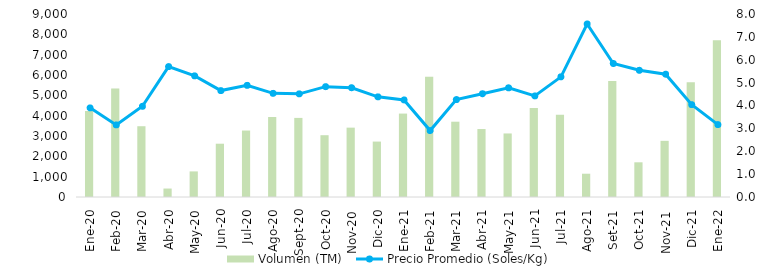
| Category | Volumen (TM)  |
|---|---|
| Ene-20 | 4225.139 |
| Feb-20 | 5332.584 |
| Mar-20 | 3480.674 |
| Abr-20 | 415.99 |
| May-20 | 1258.69 |
| Jun-20 | 2621.059 |
| Jul-20 | 3268.729 |
| Ago-20 | 3933.264 |
| Sept-20 | 3890.325 |
| Oct-20 | 3038.41 |
| Nov-20 | 3410.899 |
| Dic-20 | 2725.555 |
| Ene-21 | 4102.553 |
| Feb-21 | 5912.284 |
| Mar-21 | 3703.291 |
| Abr-21 | 3342.033 |
| May-21 | 3125.02 |
| Jun-21 | 4372.62 |
| Jul-21 | 4044.873 |
| Ago-21 | 1145.355 |
| Set-21 | 5698.816 |
| Oct-21 | 1706.015 |
| Nov-21 | 2762.334 |
| Dic-21 | 5643.831 |
| Ene-22 | 7712.431 |